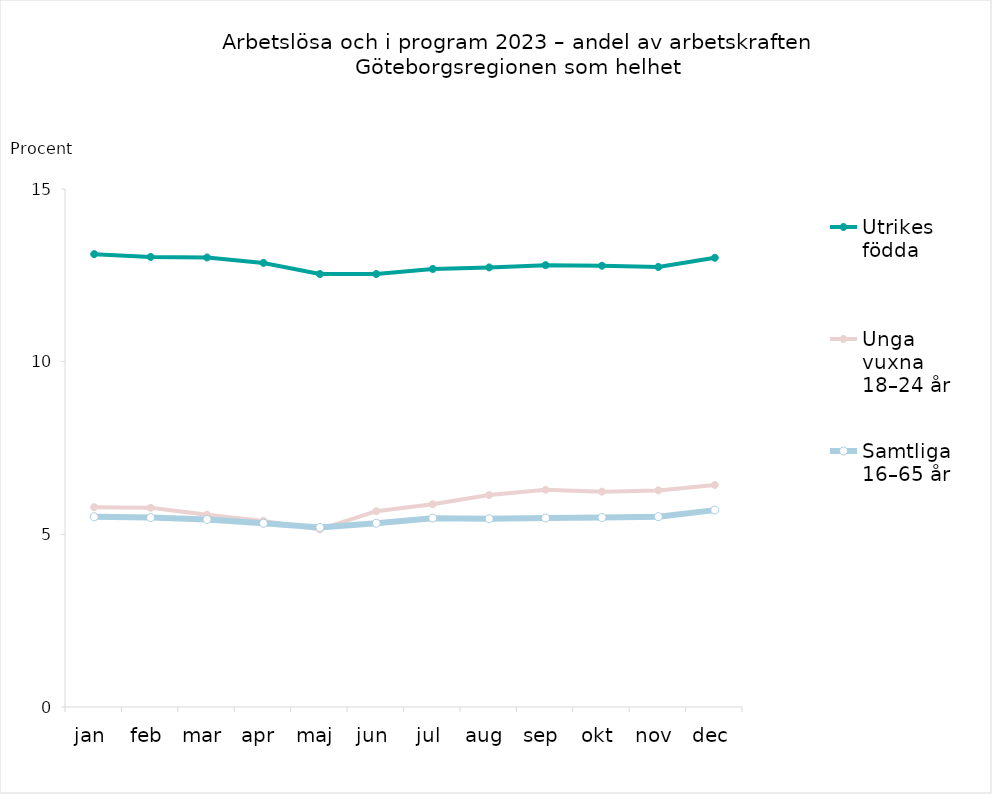
| Category | Utrikes födda | Unga vuxna 18–24 år | Samtliga 16–65 år |
|---|---|---|---|
| jan | 13.114 | 5.786 | 5.508 |
| feb | 13.033 | 5.768 | 5.485 |
| mar | 13.017 | 5.568 | 5.431 |
| apr | 12.859 | 5.39 | 5.32 |
| maj | 12.538 | 5.142 | 5.198 |
| jun | 12.539 | 5.67 | 5.322 |
| jul | 12.684 | 5.873 | 5.468 |
| aug | 12.729 | 6.136 | 5.451 |
| sep | 12.795 | 6.288 | 5.473 |
| okt | 12.778 | 6.235 | 5.487 |
| nov | 12.742 | 6.272 | 5.512 |
| dec | 13.008 | 6.429 | 5.702 |